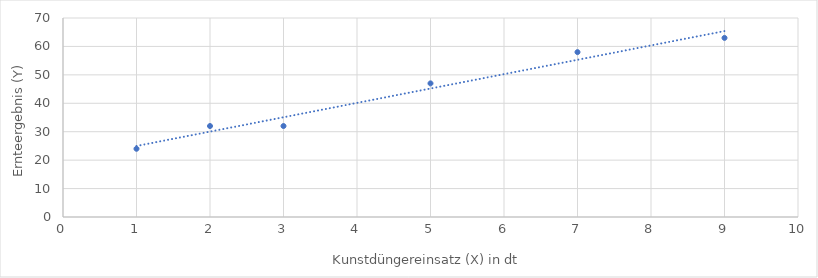
| Category | Kunstdüngereinsatz (X) in dt |
|---|---|
| 1.0 | 24 |
| 2.0 | 32 |
| 3.0 | 32 |
| 5.0 | 47 |
| 7.0 | 58 |
| 9.0 | 63 |